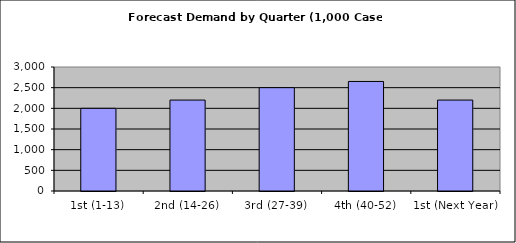
| Category | Series 0 |
|---|---|
| 1st (1-13) | 2000 |
| 2nd (14-26) | 2200 |
| 3rd (27-39) | 2500 |
| 4th (40-52) | 2650 |
| 1st (Next Year) | 2200 |